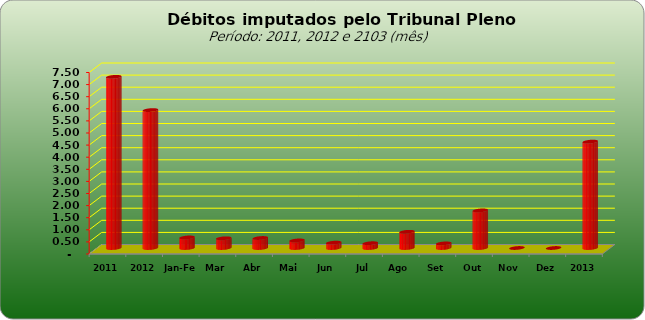
| Category |  7.073.154,74   5.698.720,25   436.112,79   401.482,76   413.229,26   313.253,71   220.510,24   197.835,92   670.047,46   189.705,54   1.552.892,31   -     -     4.395.069,99  |
|---|---|
| 2011 | 7073154.74 |
| 2012 | 5698720.25 |
| Jan-Fev | 436112.79 |
| Mar | 401482.76 |
| Abr | 413229.26 |
| Mai | 313253.71 |
| Jun | 220510.24 |
| Jul | 197835.92 |
| Ago | 670047.46 |
| Set | 189705.54 |
| Out | 1552892.31 |
| Nov | 0 |
| Dez | 0 |
| 2013 | 4395069.99 |